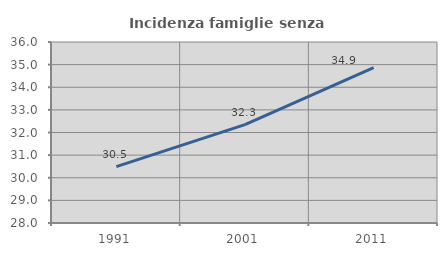
| Category | Incidenza famiglie senza nuclei |
|---|---|
| 1991.0 | 30.489 |
| 2001.0 | 32.35 |
| 2011.0 | 34.866 |